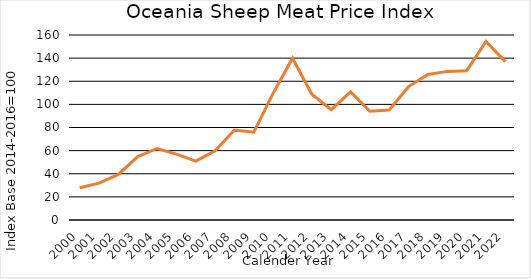
| Category | AU, NZ |
|---|---|
| 2000.0 | 27.867 |
| 2001.0 | 31.855 |
| 2002.0 | 39.464 |
| 2003.0 | 54.795 |
| 2004.0 | 61.863 |
| 2005.0 | 56.924 |
| 2006.0 | 50.945 |
| 2007.0 | 59.857 |
| 2008.0 | 77.765 |
| 2009.0 | 75.968 |
| 2010.0 | 109.667 |
| 2011.0 | 139.955 |
| 2012.0 | 108.723 |
| 2013.0 | 95.402 |
| 2014.0 | 110.782 |
| 2015.0 | 94.018 |
| 2016.0 | 95.2 |
| 2017.0 | 115.382 |
| 2018.0 | 125.83 |
| 2019.0 | 128.539 |
| 2020.0 | 129.109 |
| 2021.0 | 154.492 |
| 2022.0 | 136.947 |